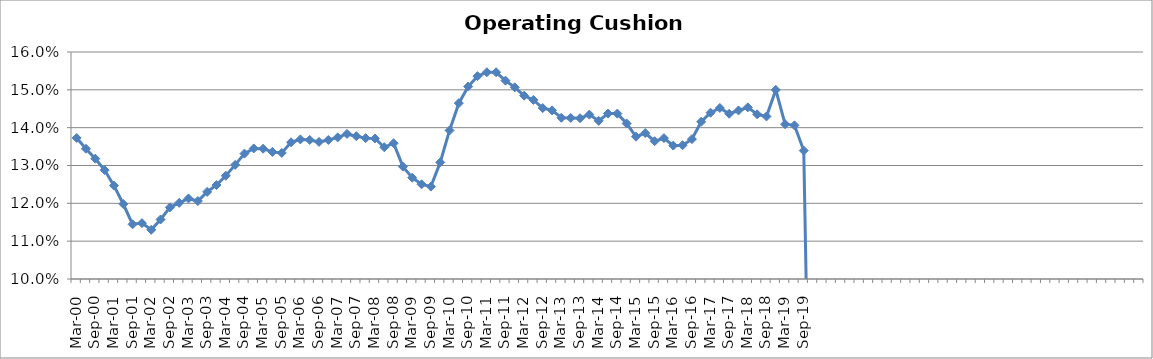
| Category | Operating Cushion % |
|---|---|
| Mar-00 | 0.137 |
| Jun-00 | 0.134 |
| Sep-00 | 0.132 |
| Dec-00 | 0.129 |
| Mar-01 | 0.125 |
| Jun-01 | 0.12 |
| Sep-01 | 0.114 |
| Dec-01 | 0.115 |
| Mar-02 | 0.113 |
| Jun-02 | 0.116 |
| Sep-02 | 0.119 |
| Dec-02 | 0.12 |
| Mar-03 | 0.121 |
| Jun-03 | 0.121 |
| Sep-03 | 0.123 |
| Dec-03 | 0.125 |
| Mar-04 | 0.127 |
| Jun-04 | 0.13 |
| Sep-04 | 0.133 |
| Dec-04 | 0.135 |
| Mar-05 | 0.134 |
| Jun-05 | 0.134 |
| Sep-05 | 0.133 |
| Dec-05 | 0.136 |
| Mar-06 | 0.137 |
| Jun-06 | 0.137 |
| Sep-06 | 0.136 |
| Dec-06 | 0.137 |
| Mar-07 | 0.137 |
| Jun-07 | 0.138 |
| Sep-07 | 0.138 |
| Dec-07 | 0.137 |
| Mar-08 | 0.137 |
| Jun-08 | 0.135 |
| Sep-08 | 0.136 |
| Dec-08 | 0.13 |
| Mar-09 | 0.127 |
| Jun-09 | 0.125 |
| Sep-09 | 0.124 |
| Dec-09 | 0.131 |
| Mar-10 | 0.139 |
| Jun-10 | 0.146 |
| Sep-10 | 0.151 |
| Dec-10 | 0.154 |
| Mar-11 | 0.155 |
| Jun-11 | 0.155 |
| Sep-11 | 0.152 |
| Dec-11 | 0.151 |
| Mar-12 | 0.148 |
| Jun-12 | 0.147 |
| Sep-12 | 0.145 |
| Dec-12 | 0.145 |
| Mar-13 | 0.143 |
| Jun-13 | 0.143 |
| Sep-13 | 0.142 |
| Dec-13 | 0.143 |
| Mar-14 | 0.142 |
| Jun-14 | 0.144 |
| Sep-14 | 0.144 |
| Dec-14 | 0.141 |
| Mar-15 | 0.138 |
| Jun-15 | 0.139 |
| Sep-15 | 0.136 |
| Dec-15 | 0.137 |
| Mar-16 | 0.135 |
| Jun-16 | 0.135 |
| Sep-16 | 0.137 |
| Dec-16 | 0.142 |
| Mar-17 | 0.144 |
| Jun-17 | 0.145 |
| Sep-17 | 0.144 |
| Dec-17 | 0.145 |
| Mar-18 | 0.145 |
| Jun-18 | 0.144 |
| Sep-18 | 0.143 |
| Dec-18 | 0.15 |
| Mar-19 | 0.141 |
| Jun-19 | 0.141 |
| Sep-19 | 0.134 |